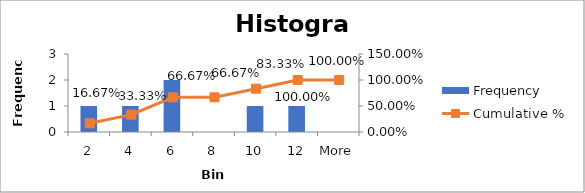
| Category | Frequency |
|---|---|
| 2 | 1 |
| 4 | 1 |
| 6 | 2 |
| 8 | 0 |
| 10 | 1 |
| 12 | 1 |
| More | 0 |